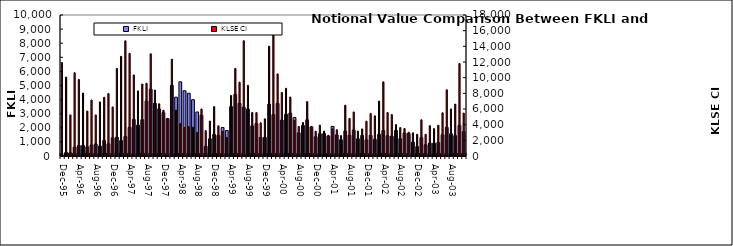
| Category | FKLI  |
|---|---|
| 1995-12-01 | 66.728 |
| 1996-01-01 | 249.122 |
| 1996-02-01 | 230.304 |
| 1996-03-01 | 628.756 |
| 1996-04-01 | 745.081 |
| 1996-05-01 | 751.225 |
| 1996-06-01 | 648.292 |
| 1996-07-01 | 784.491 |
| 1996-08-01 | 854.765 |
| 1996-09-01 | 705.505 |
| 1996-10-01 | 1104.204 |
| 1996-11-01 | 861.4 |
| 1996-12-01 | 1291.8 |
| 1997-01-01 | 1341.167 |
| 1997-02-01 | 1092.931 |
| 1997-03-01 | 1383.481 |
| 1997-04-01 | 2034.656 |
| 1997-05-01 | 2594.213 |
| 1997-06-01 | 2191.162 |
| 1997-07-01 | 2575.654 |
| 1997-08-01 | 3894.754 |
| 1997-09-01 | 4738.235 |
| 1997-10-01 | 3738.837 |
| 1997-11-01 | 3335.404 |
| 1997-12-01 | 3075.592 |
| 1998-01-01 | 2646.177 |
| 1998-02-01 | 5008.457 |
| 1998-03-01 | 4173.303 |
| 1998-04-01 | 5259.84 |
| 1998-05-01 | 4628.27 |
| 1998-06-01 | 4451.96 |
| 1998-07-01 | 3993.67 |
| 1998-08-01 | 3122.4 |
| 1998-09-01 | 2898.245 |
| 1998-10-01 | 691.37 |
| 1998-11-01 | 1217.83 |
| 1998-12-01 | 1529.69 |
| 1999-01-01 | 1463.754 |
| 1999-02-01 | 2018.657 |
| 1999-03-01 | 1809.569 |
| 1999-04-01 | 3504.262 |
| 1999-05-01 | 4373.214 |
| 1999-06-01 | 3731.313 |
| 1999-07-01 | 3458.659 |
| 1999-08-01 | 3325.85 |
| 1999-09-01 | 2137.982 |
| 1999-10-01 | 2299.511 |
| 1999-11-01 | 1313.774 |
| 1999-12-01 | 1323.921 |
| 2000-01-01 | 3669.533 |
| 2000-02-01 | 2933.479 |
| 2000-03-01 | 3731.579 |
| 2000-04-01 | 2540.663 |
| 2000-05-01 | 2955.281 |
| 2000-06-01 | 3044.745 |
| 2000-07-01 | 2725.966 |
| 2000-08-01 | 1642.643 |
| 2000-09-01 | 2169.282 |
| 2000-10-01 | 2564.17 |
| 2000-11-01 | 2064.262 |
| 2000-12-01 | 1363.955 |
| 2001-01-01 | 1579.888 |
| 2001-02-01 | 1585.025 |
| 2001-03-01 | 1403.716 |
| 2001-04-01 | 2098.962 |
| 2001-05-01 | 1497.598 |
| 2001-06-01 | 1150.424 |
| 2001-07-01 | 1768.056 |
| 2001-08-01 | 1462.661 |
| 2001-09-01 | 1847.55 |
| 2001-10-01 | 1215.558 |
| 2001-11-01 | 1461.089 |
| 2001-12-01 | 1150.412 |
| 2002-01-01 | 1462.812 |
| 2002-02-01 | 1178.124 |
| 2002-03-01 | 1538.686 |
| 2002-04-01 | 1801.201 |
| 2002-05-01 | 1433.669 |
| 2002-06-01 | 1398.535 |
| 2002-07-01 | 1814.321 |
| 2002-08-01 | 1230.126 |
| 2002-09-01 | 1632.764 |
| 2002-10-01 | 1592.942 |
| 2002-11-01 | 985.958 |
| 2002-12-01 | 671.719 |
| 2003-01-01 | 1305.398 |
| 2003-02-01 | 798.063 |
| 2003-03-01 | 913.732 |
| 2003-04-01 | 910.498 |
| 2003-05-01 | 951.214 |
| 2003-06-01 | 1500.482 |
| 2003-07-01 | 2031.145 |
| 2003-08-01 | 1575.547 |
| 2003-09-01 | 1448.042 |
| 2003-10-01 | 2175.83 |
| 2003-11-01 | 1722.655 |